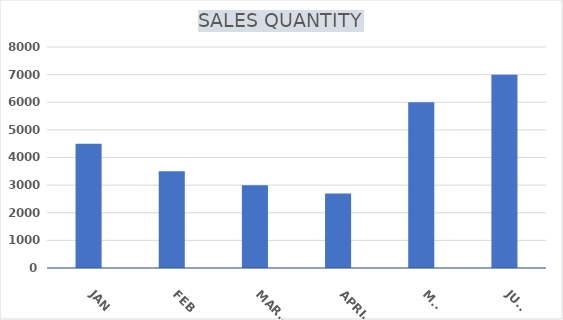
| Category | SALES QUANTITY |
|---|---|
| JAN | 4500 |
| FEB | 3500 |
| MARCH | 3000 |
| APRIL  | 2700 |
| MAY | 6000 |
| JUNE | 7000 |